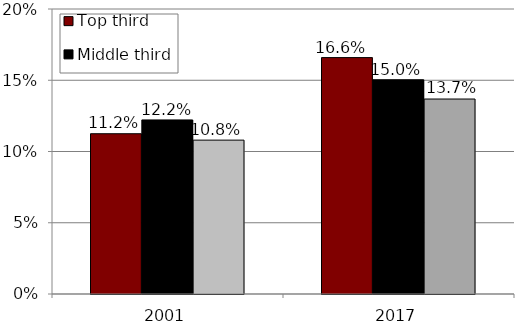
| Category | Top third | Middle third | Bottom third |
|---|---|---|---|
| 2001.0 | 0.112 | 0.122 | 0.108 |
| 2017.0 | 0.166 | 0.15 | 0.137 |